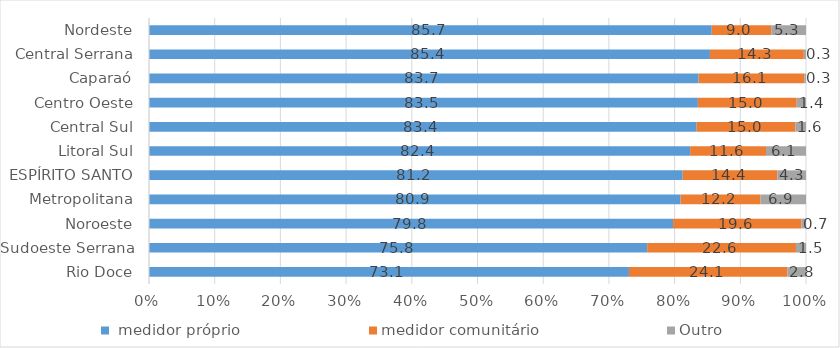
| Category |  medidor próprio | medidor comunitário | Outro |
|---|---|---|---|
| Rio Doce | 73.052 | 24.121 | 2.827 |
| Sudoeste Serrana | 75.828 | 22.644 | 1.529 |
| Noroeste | 79.763 | 19.551 | 0.685 |
| Metropolitana | 80.907 | 12.175 | 6.919 |
| ESPÍRITO SANTO | 81.234 | 14.418 | 4.348 |
| Litoral Sul | 82.365 | 11.55 | 6.084 |
| Central Sul | 83.354 | 15.027 | 1.619 |
| Centro Oeste | 83.544 | 15.041 | 1.416 |
| Caparaó | 83.659 | 16.08 | 0.261 |
| Central Serrana | 85.377 | 14.295 | 0.327 |
| Nordeste | 85.655 | 9.048 | 5.297 |